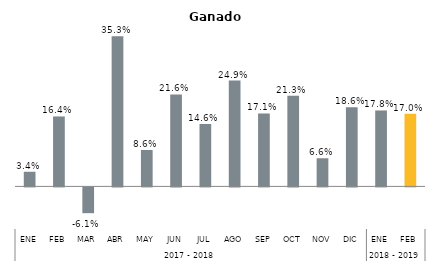
| Category | Jalisco |
|---|---|
| 0 | 0.034 |
| 1 | 0.164 |
| 2 | -0.061 |
| 3 | 0.353 |
| 4 | 0.086 |
| 5 | 0.216 |
| 6 | 0.146 |
| 7 | 0.249 |
| 8 | 0.171 |
| 9 | 0.213 |
| 10 | 0.066 |
| 11 | 0.186 |
| 12 | 0.178 |
| 13 | 0.17 |